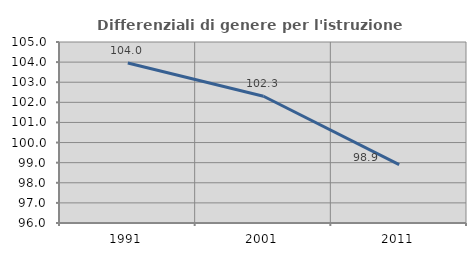
| Category | Differenziali di genere per l'istruzione superiore |
|---|---|
| 1991.0 | 103.952 |
| 2001.0 | 102.301 |
| 2011.0 | 98.904 |